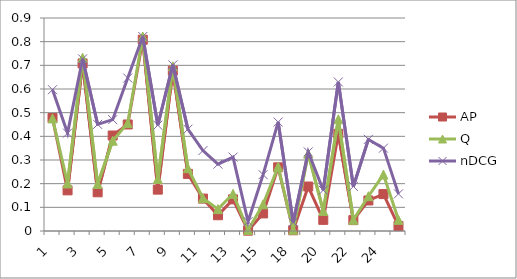
| Category | AP | Q | nDCG |
|---|---|---|---|
| 1.0 | 0.477 | 0.476 | 0.597 |
| 2.0 | 0.172 | 0.201 | 0.414 |
| 3.0 | 0.708 | 0.732 | 0.727 |
| 4.0 | 0.164 | 0.199 | 0.451 |
| 5.0 | 0.404 | 0.382 | 0.47 |
| 6.0 | 0.45 | 0.456 | 0.646 |
| 7.0 | 0.808 | 0.822 | 0.822 |
| 8.0 | 0.175 | 0.22 | 0.447 |
| 9.0 | 0.678 | 0.696 | 0.702 |
| 10.0 | 0.241 | 0.265 | 0.43 |
| 11.0 | 0.137 | 0.139 | 0.34 |
| 12.0 | 0.067 | 0.092 | 0.282 |
| 13.0 | 0.134 | 0.157 | 0.312 |
| 14.0 | 0.001 | 0.004 | 0.04 |
| 15.0 | 0.074 | 0.113 | 0.238 |
| 16.0 | 0.269 | 0.272 | 0.46 |
| 18.0 | 0.003 | 0.005 | 0.037 |
| 19.0 | 0.188 | 0.327 | 0.334 |
| 20.0 | 0.047 | 0.085 | 0.172 |
| 21.0 | 0.41 | 0.472 | 0.63 |
| 22.0 | 0.046 | 0.047 | 0.188 |
| 23.0 | 0.129 | 0.147 | 0.387 |
| 24.0 | 0.156 | 0.238 | 0.35 |
| 25.0 | 0.021 | 0.047 | 0.157 |